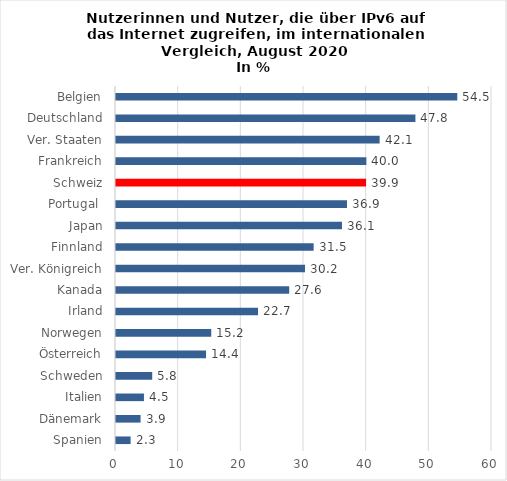
| Category | Series 0 |
|---|---|
| Spanien | 2.33 |
| Dänemark | 3.92 |
| Italien | 4.46 |
| Schweden | 5.78 |
| Österreich | 14.37 |
| Norwegen | 15.2 |
| Irland | 22.66 |
| Kanada | 27.64 |
| Ver. Königreich | 30.16 |
| Finnland | 31.54 |
| Japan | 36.06 |
| Portugal  | 36.86 |
| Schweiz | 39.9 |
| Frankreich | 39.95 |
| Ver. Staaten | 42.07 |
| Deutschland | 47.78 |
| Belgien | 54.46 |